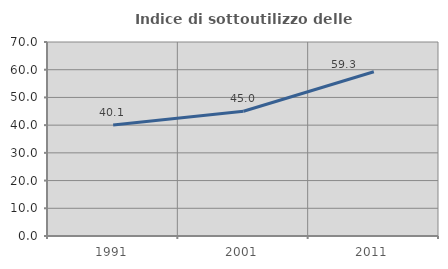
| Category | Indice di sottoutilizzo delle abitazioni  |
|---|---|
| 1991.0 | 40.088 |
| 2001.0 | 45 |
| 2011.0 | 59.259 |